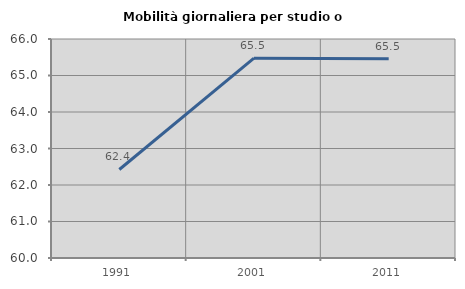
| Category | Mobilità giornaliera per studio o lavoro |
|---|---|
| 1991.0 | 62.425 |
| 2001.0 | 65.475 |
| 2011.0 | 65.457 |